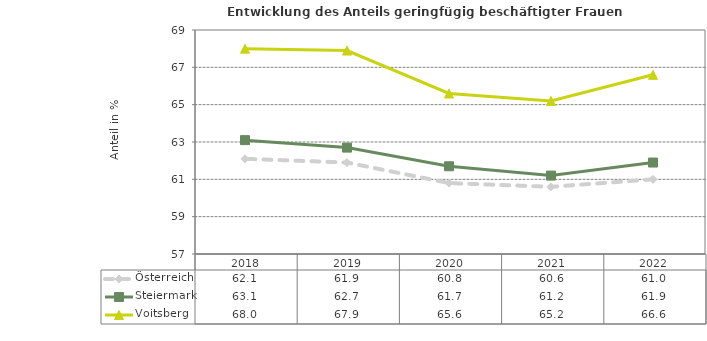
| Category | Österreich | Steiermark | Voitsberg |
|---|---|---|---|
| 2022.0 | 61 | 61.9 | 66.6 |
| 2021.0 | 60.6 | 61.2 | 65.2 |
| 2020.0 | 60.8 | 61.7 | 65.6 |
| 2019.0 | 61.9 | 62.7 | 67.9 |
| 2018.0 | 62.1 | 63.1 | 68 |